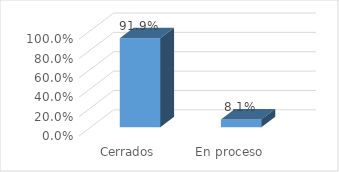
| Category | PORCENTAJE |
|---|---|
| Cerrados | 0.919 |
| En proceso | 0.081 |